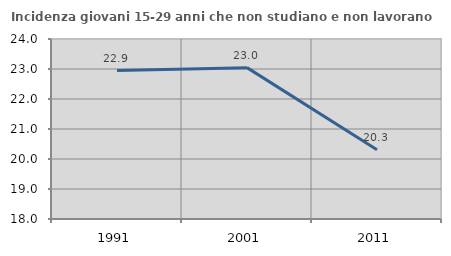
| Category | Incidenza giovani 15-29 anni che non studiano e non lavorano  |
|---|---|
| 1991.0 | 22.946 |
| 2001.0 | 23.045 |
| 2011.0 | 20.312 |